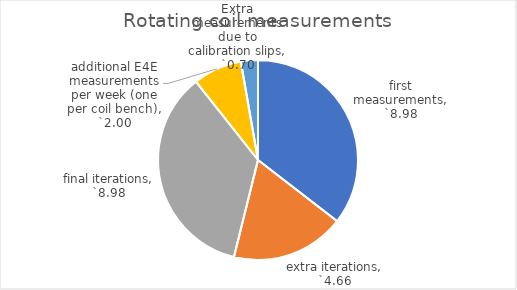
| Category | Rotating coil measurements |
|---|---|
| first measurements | 8.98 |
| extra iterations | 4.656 |
| final iterations | 8.98 |
| additional E4E measurements per week (one per coil bench) | 2 |
| Extra measurements due to calibration slips | 0.698 |